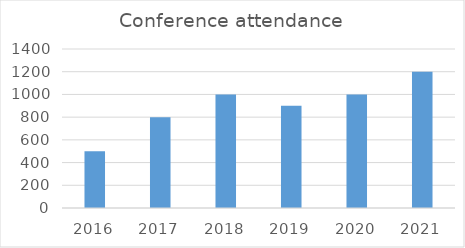
| Category | Conference attendance |
|---|---|
| 2016.0 | 500 |
| 2017.0 | 800 |
| 2018.0 | 1000 |
| 2019.0 | 900 |
| 2020.0 | 1000 |
| 2021.0 | 1200 |